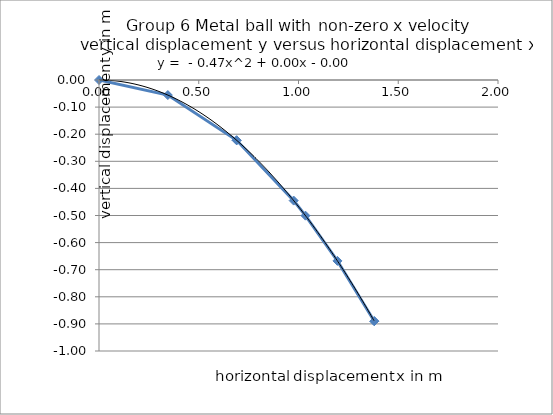
| Category | Series 0 |
|---|---|
| 0.0 | 0 |
| 0.345 | -0.056 |
| 0.69 | -0.222 |
| 0.69 | -0.223 |
| 0.9758073580374356 | -0.445 |
| 1.035 | -0.501 |
| 1.1951150572225253 | -0.668 |
| 1.38 | -0.89 |
| 1.38 | -0.89 |